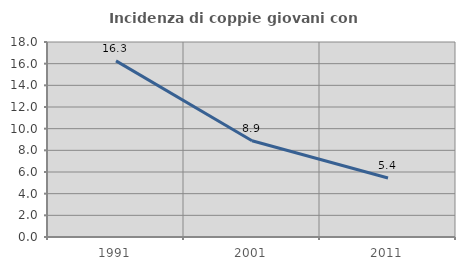
| Category | Incidenza di coppie giovani con figli |
|---|---|
| 1991.0 | 16.255 |
| 2001.0 | 8.882 |
| 2011.0 | 5.443 |